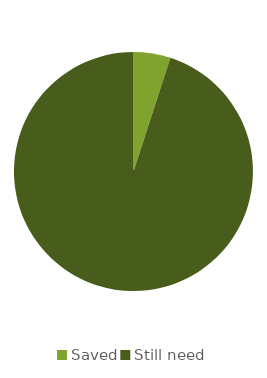
| Category | Series 0 | Series 1 |
|---|---|---|
| 0 | 300 |  |
| 1 | 5700 |  |